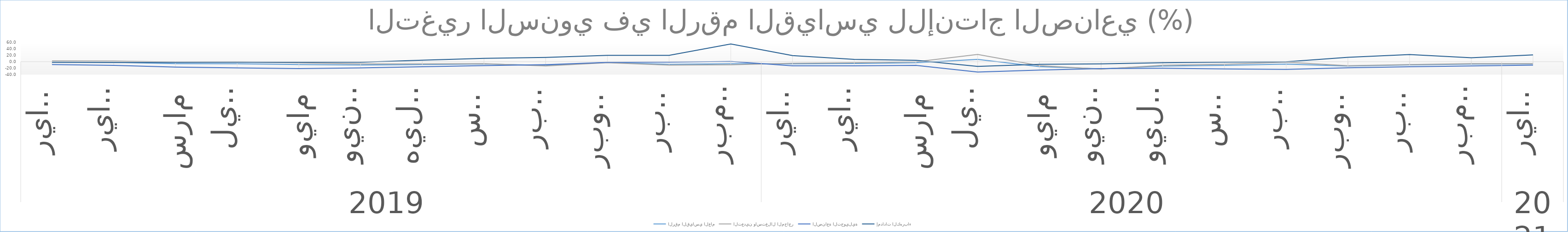
| Category | الرقم القياسي العام | التعدين واستغلال المحاجر | الصناعة التحويلية | إمدادات الكهرباء |
|---|---|---|---|---|
| 0 | -0.857 | 2.601 | -8.927 | -2.312 |
| 1 | -2.035 | 2.022 | -11.391 | -2.327 |
| 2 | -5.964 | -1.211 | -16.817 | -2.316 |
| 3 | -6.38 | -0.621 | -19.237 | -1.667 |
| 4 | -9.002 | -3.59 | -21.512 | -1.665 |
| 5 | -10.277 | -6.821 | -19.3 | -1.668 |
| 6 | -9.102 | -6.881 | -15.743 | 4.561 |
| 7 | -7.269 | -5.983 | -12.223 | 10.287 |
| 8 | -11.29 | -13.07 | -9.189 | 13.102 |
| 9 | -2.453 | -3.184 | -2.174 | 19.531 |
| 10 | -8.104 | -10.842 | -1.491 | 19.525 |
| 11 | -6.346 | -9.728 | 0.865 | 55.054 |
| 12 | -6.678 | -4.87 | -12.713 | 18.833 |
| 13 | -5.721 | -3.383 | -12.699 | 7.29 |
| 14 | -3.286 | -0.425 | -11.458 | 4.264 |
| 15 | 7.045 | 22.529 | -32.113 | -14.582 |
| 16 | -15.524 | -11.981 | -25.912 | -8.083 |
| 17 | -22.237 | -23.228 | -21.588 | -6.8 |
| 18 | -13.408 | -11.182 | -20.528 | -3.043 |
| 19 | -11.586 | -7.899 | -22.663 | -1.252 |
| 20 | -7.524 | -1.265 | -23.759 | -0.351 |
| 21 | -13.505 | -12.592 | -18.786 | 13.522 |
| 22 | -10.004 | -8.957 | -15.561 | 22.245 |
| 23 | -7.597 | -6.197 | -13.091 | 12.201 |
| 24 | -6.887 | -6.234 | -10.62 | 21.01 |